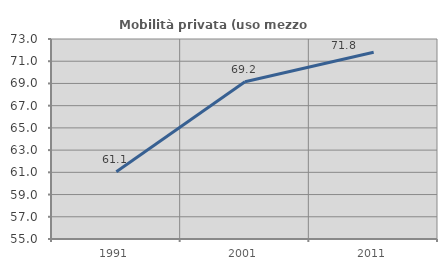
| Category | Mobilità privata (uso mezzo privato) |
|---|---|
| 1991.0 | 61.058 |
| 2001.0 | 69.151 |
| 2011.0 | 71.813 |